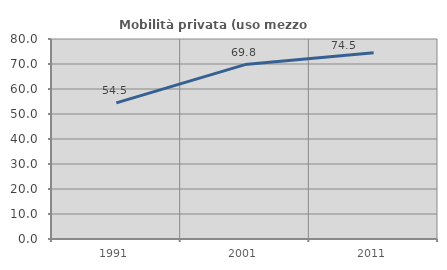
| Category | Mobilità privata (uso mezzo privato) |
|---|---|
| 1991.0 | 54.452 |
| 2001.0 | 69.758 |
| 2011.0 | 74.489 |